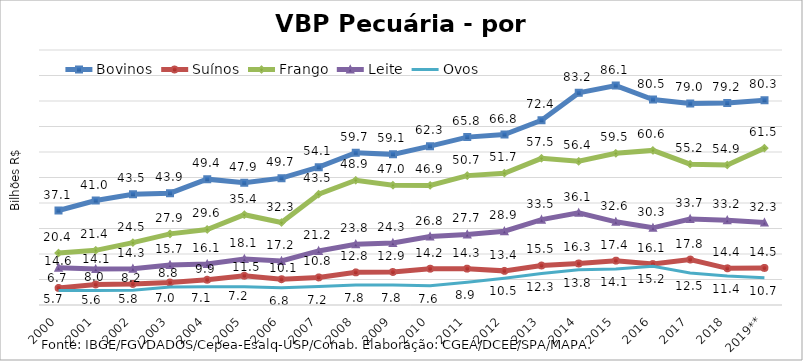
| Category | Bovinos | Suínos | Frango | Leite | Ovos |
|---|---|---|---|---|---|
| 2000 | 37.053 | 6.709 | 20.388 | 14.635 | 5.722 |
| 2001 | 40.958 | 8.049 | 21.43 | 14.083 | 5.639 |
| 2002 | 43.464 | 8.249 | 24.461 | 14.261 | 5.81 |
| 2003 | 43.867 | 8.816 | 27.888 | 15.704 | 7.027 |
| 2004 | 49.355 | 9.912 | 29.613 | 16.05 | 7.122 |
| 2005 | 47.917 | 11.493 | 35.404 | 18.052 | 7.171 |
| 2006 | 49.75 | 10.109 | 32.344 | 17.243 | 6.812 |
| 2007 | 54.066 | 10.81 | 43.457 | 21.197 | 7.239 |
| 2008 | 59.696 | 12.8 | 48.918 | 23.846 | 7.818 |
| 2009 | 59.073 | 12.939 | 46.969 | 24.311 | 7.796 |
| 2010 | 62.281 | 14.234 | 46.912 | 26.848 | 7.582 |
| 2011 | 65.84 | 14.257 | 50.737 | 27.677 | 8.934 |
| 2012 | 66.822 | 13.386 | 51.684 | 28.922 | 10.473 |
| 2013 | 72.411 | 15.499 | 57.525 | 33.468 | 12.317 |
| 2014 | 83.187 | 16.279 | 56.362 | 36.141 | 13.839 |
| 2015 | 86.05 | 17.397 | 59.5 | 32.623 | 14.091 |
| 2016 | 80.547 | 16.055 | 60.627 | 30.271 | 15.191 |
| 2017 | 79.043 | 17.823 | 55.221 | 33.728 | 12.521 |
| 2018 | 79.226 | 14.385 | 54.92 | 33.216 | 11.355 |
| 2019** | 80.329 | 14.54 | 61.519 | 32.336 | 10.666 |